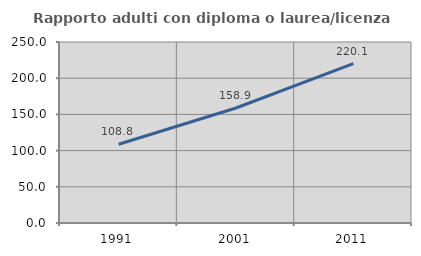
| Category | Rapporto adulti con diploma o laurea/licenza media  |
|---|---|
| 1991.0 | 108.821 |
| 2001.0 | 158.865 |
| 2011.0 | 220.146 |